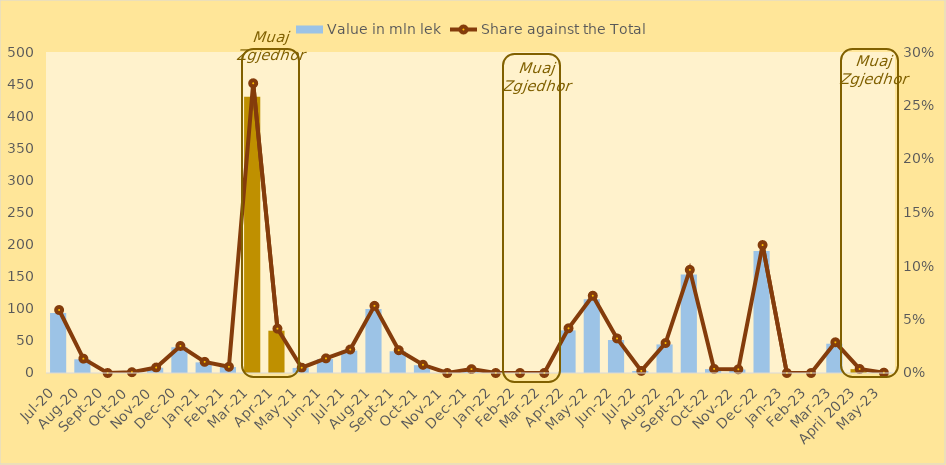
| Category | Value in mln lek |
|---|---|
| Jul-20 | 93.6 |
| Aug-20 | 21.33 |
| Sep-20 | 0 |
| Oct-20 | 1.17 |
| Nov-20 | 8.12 |
| Dec-20 | 40.16 |
| Jan-21 | 16.57 |
| Feb-21 | 9.22 |
| Mar-21 | 430.407 |
| Apr-21 | 65.889 |
| May-21 | 7.85 |
| Jun-21 | 21.75 |
| Jul-21 | 34.868 |
| Aug-21 | 99.769 |
| Sep-21 | 33.865 |
| Oct-21 | 12.186 |
| Nov-21 | 0 |
| Dec-21 | 5.732 |
| Jan-22 | 0 |
| Feb-22 | 0 |
| Mar-22 | 0 |
| Apr-22 | 66.38 |
| May-22 | 114.807 |
| Jun-22 | 51.348 |
| Jul-22 | 3.104 |
| Aug-22 | 44.497 |
| Sep-22 | 153.232 |
| Oct-22 | 6.083 |
| Nov-22 | 5.457 |
| Dec-22 | 190.107 |
| Jan-23 | 0 |
| Feb-23 | 0 |
| Mar-23 | 45.603 |
| April 2023 | 5.991 |
| May-23 | 0.48 |